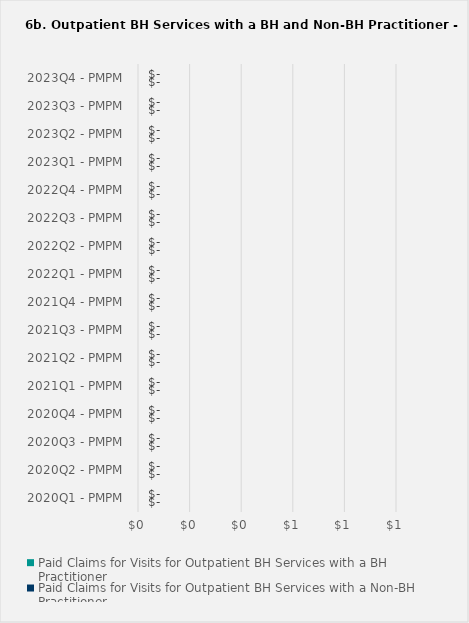
| Category | Paid Claims for Visits for Outpatient BH Services with a BH Practitioner | Paid Claims for Visits for Outpatient BH Services with a Non-BH Practitioner |
|---|---|---|
| 2020Q1 - PMPM | 0 | 0 |
| 2020Q2 - PMPM | 0 | 0 |
| 2020Q3 - PMPM | 0 | 0 |
| 2020Q4 - PMPM | 0 | 0 |
| 2021Q1 - PMPM | 0 | 0 |
| 2021Q2 - PMPM | 0 | 0 |
| 2021Q3 - PMPM | 0 | 0 |
| 2021Q4 - PMPM | 0 | 0 |
| 2022Q1 - PMPM | 0 | 0 |
| 2022Q2 - PMPM | 0 | 0 |
| 2022Q3 - PMPM | 0 | 0 |
| 2022Q4 - PMPM | 0 | 0 |
| 2023Q1 - PMPM | 0 | 0 |
| 2023Q2 - PMPM | 0 | 0 |
| 2023Q3 - PMPM | 0 | 0 |
| 2023Q4 - PMPM | 0 | 0 |